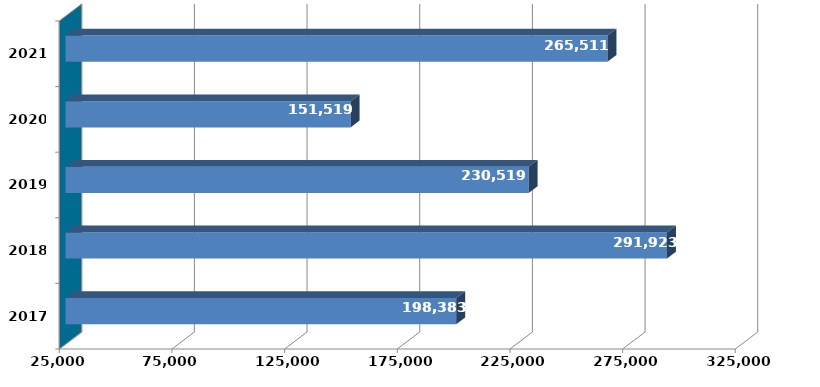
| Category |  Column2  |
|---|---|
| 2017.0 | 198382761 |
| 2018.0 | 291922985 |
| 2019.0 | 230519280 |
| 2020.0 | 151518535 |
| 2021.0 | 265511127 |